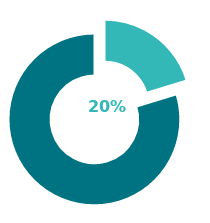
| Category | Series 0 |
|---|---|
| 0 | 0.203 |
| 1 | 0.797 |